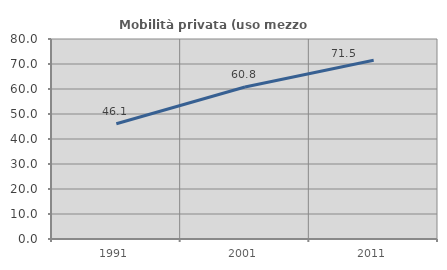
| Category | Mobilità privata (uso mezzo privato) |
|---|---|
| 1991.0 | 46.105 |
| 2001.0 | 60.815 |
| 2011.0 | 71.485 |